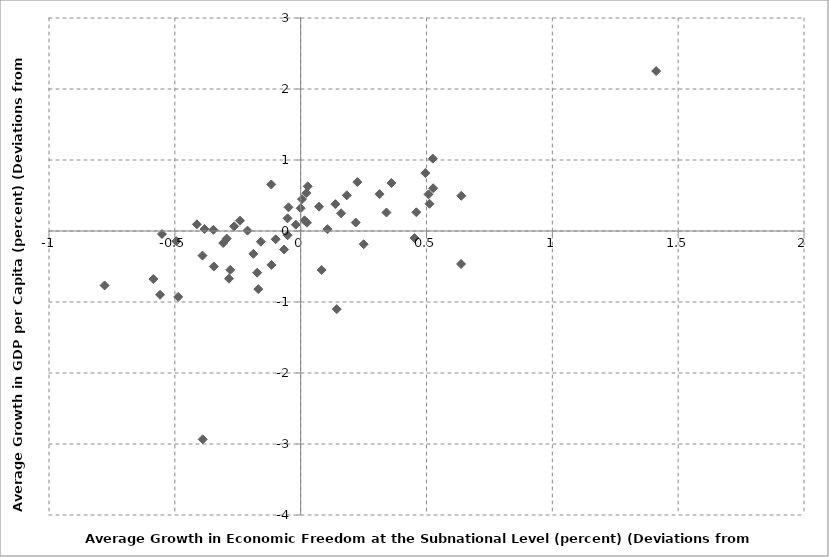
| Category | Series 0 |
|---|---|
| -0.11608281863039732 | -0.477 |
| 0.14347647967085211 | -1.1 |
| -0.585234821814925 | -0.676 |
| 0.18327893243875407 | 0.503 |
| 1.4125880701667572 | 2.253 |
| -0.26431510435536115 | 0.066 |
| -0.7791642346205531 | -0.767 |
| -0.24100329537137624 | 0.146 |
| -0.2799340734203613 | -0.549 |
| 0.5263908659366109 | 0.602 |
| -0.21141599869162445 | 0.006 |
| -0.3891515026740581 | -2.934 |
| -0.39013299027512977 | -0.346 |
| -0.3467051455547483 | 0.017 |
| -0.06585509497233452 | -0.261 |
| -0.29359086562741643 | -0.106 |
| -0.1169449865938811 | 0.656 |
| 0.5251033794137113 | 1.019 |
| -0.5510815180730272 | -0.043 |
| 0.21892970096142939 | 0.119 |
| 0.25036401177039397 | -0.186 |
| -0.1878734641994137 | -0.322 |
| 0.02506471664321574 | 0.117 |
| -0.019390801684674157 | 0.089 |
| -0.38184643520371264 | 0.028 |
| -0.09938619575440648 | -0.117 |
| -0.3077956684540955 | -0.169 |
| -0.28489669818494934 | -0.672 |
| 0.0730029630311812 | 0.343 |
| 0.3134385170105652 | 0.519 |
| 0.36042745462905973 | 0.676 |
| 0.637248677030881 | -0.465 |
| 0.45954411881314344 | 0.264 |
| -0.4940679549969543 | -0.143 |
| -0.05182091055941189 | -0.06 |
| -0.17292066089385577 | -0.587 |
| -3.2059036794239556e-05 | 0.32 |
| 0.08344539226205189 | -0.549 |
| 0.028068449872442655 | 0.629 |
| 0.02254928732228929 | 0.535 |
| -0.558698867197381 | -0.898 |
| 0.5119497636915995 | 0.384 |
| 0.005168623596094677 | 0.448 |
| -0.04838402263459941 | 0.334 |
| -0.15826212719636648 | -0.151 |
| -0.16823647872009354 | -0.819 |
| 0.6381862307043757 | 0.496 |
| 0.34093088421608064 | 0.261 |
| 0.5079147391715868 | 0.516 |
| -0.4123720796449367 | 0.094 |
| 0.49541447432464814 | 0.816 |
| -0.052143775702758494 | 0.179 |
| -0.34507465145590877 | -0.5 |
| 0.16068873892806912 | 0.25 |
| 0.1380090448314714 | 0.378 |
| 0.22525869535146006 | 0.689 |
| 0.01529694001717347 | 0.15 |
| 0.4521654447457727 | -0.099 |
| 0.10647182456335158 | 0.026 |
| -0.48656111891951603 | -0.928 |